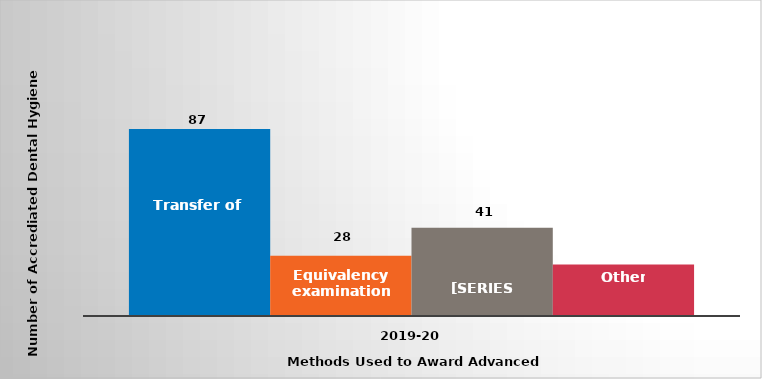
| Category | Transfer of credit | Equivalency examinations | Challenge examinations | Other |
|---|---|---|---|---|
| 2019-20 | 87 | 28 | 41 | 24 |